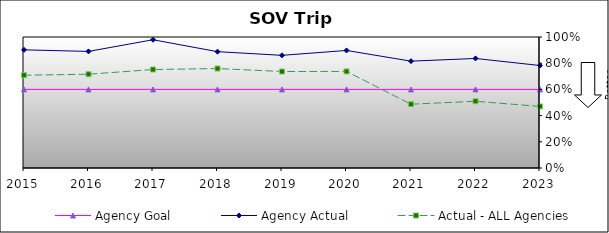
| Category | Agency Goal | Agency Actual | Actual - ALL Agencies |
|---|---|---|---|
| 2015.0 | 0.6 | 0.902 | 0.708 |
| 2016.0 | 0.6 | 0.89 | 0.716 |
| 2017.0 | 0.6 | 0.979 | 0.752 |
| 2018.0 | 0.6 | 0.888 | 0.759 |
| 2019.0 | 0.6 | 0.86 | 0.736 |
| 2020.0 | 0.6 | 0.897 | 0.737 |
| 2021.0 | 0.6 | 0.816 | 0.487 |
| 2022.0 | 0.6 | 0.836 | 0.509 |
| 2023.0 | 0.6 | 0.782 | 0.47 |